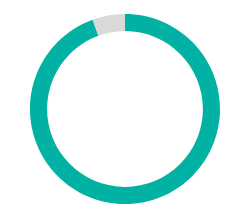
| Category | Series 0 |
|---|---|
| 0 | 0.945 |
| 1 | 0.055 |